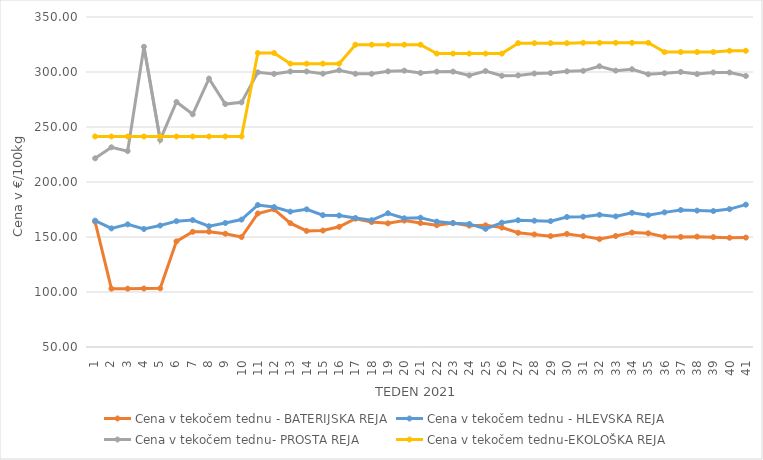
| Category | Cena v tekočem tednu - BATERIJSKA REJA | Cena v tekočem tednu - HLEVSKA REJA | Cena v tekočem tednu- PROSTA REJA | Cena v tekočem tednu-EKOLOŠKA REJA |
|---|---|---|---|---|
| 1.0 | 163.81 | 164.86 | 221.55 | 241.38 |
| 2.0 | 103.02 | 157.81 | 231.55 | 241.38 |
| 3.0 | 103.03 | 161.48 | 228.1 | 241.38 |
| 4.0 | 103.15 | 157.29 | 322.93 | 241.38 |
| 5.0 | 103.34 | 160.43 | 238.28 | 241.38 |
| 6.0 | 146.03 | 164.39 | 272.76 | 241.38 |
| 7.0 | 154.77 | 165.34 | 261.55 | 241.38 |
| 8.0 | 154.86 | 159.79 | 293.97 | 241.38 |
| 9.0 | 153 | 162.73 | 270.86 | 241.38 |
| 10.0 | 149.98 | 165.85 | 272.41 | 241.38 |
| 11.0 | 171.4 | 179.09 | 299.66 | 317.24 |
| 12.0 | 175.2 | 177.21 | 298.27 | 317.24 |
| 13.0 | 162.57 | 173.07 | 300.45 | 307.59 |
| 14.0 | 155.55 | 175.17 | 300.49 | 307.59 |
| 15.0 | 155.88 | 169.83 | 298.52 | 307.59 |
| 16.0 | 159.26 | 169.55 | 301.6 | 307.59 |
| 17.0 | 166.66 | 167.25 | 298.38 | 324.83 |
| 18.0 | 163.58 | 165.28 | 298.35 | 324.83 |
| 19.0 | 162.44 | 171.6 | 300.59 | 324.83 |
| 20.0 | 164.94 | 167.01 | 301.21 | 324.83 |
| 21.0 | 162.64 | 167.56 | 299.14 | 324.83 |
| 22.0 | 160.68 | 164.01 | 300.34 | 316.72 |
| 23.0 | 162.75 | 162.58 | 300.35 | 316.72 |
| 24.0 | 160.34 | 161.89 | 296.9 | 316.72 |
| 25.0 | 160.61 | 157.42 | 300.86 | 316.72 |
| 26.0 | 158.57 | 163.03 | 296.55 | 316.72 |
| 27.0 | 153.83 | 165.23 | 296.9 | 326.21 |
| 28.0 | 152.35 | 164.83 | 298.63 | 326.21 |
| 29.0 | 150.79 | 164.42 | 299.08 | 326.21 |
| 30.0 | 152.82 | 168.2 | 300.63 | 326.21 |
| 31.0 | 150.8 | 168.4 | 301.07 | 326.55 |
| 32.0 | 148.1 | 170.19 | 305.2 | 326.55 |
| 33.0 | 150.88 | 168.74 | 301.25 | 326.55 |
| 34.0 | 154.04 | 172.03 | 302.51 | 326.55 |
| 35.0 | 153.37 | 169.81 | 297.92 | 326.55 |
| 36.0 | 150.21 | 172.4 | 298.86 | 318.1 |
| 37.0 | 150.06 | 174.54 | 300.07 | 318.1 |
| 38.0 | 150.32 | 173.99 | 298.12 | 318.1 |
| 39.0 | 149.86 | 173.58 | 299.58 | 318.1 |
| 40.0 | 149.34 | 175.36 | 299.56 | 319.31 |
| 41.0 | 149.48 | 179.4 | 296.38 | 319.31 |